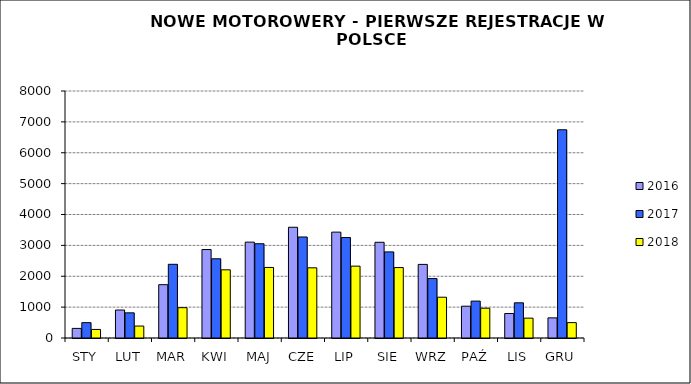
| Category | 2016 | 2017 | 2018 |
|---|---|---|---|
|  STY  | 311 | 497 | 277 |
|  LUT  | 906 | 815 | 387 |
| MAR | 1727 | 2387 | 982 |
| KWI | 2865 | 2566 | 2208 |
| MAJ | 3105 | 3053 | 2285 |
| CZE | 3587 | 3272 | 2273 |
| LIP | 3429 | 3254 | 2327 |
| SIE | 3100 | 2789 | 2281 |
| WRZ | 2384 | 1925 | 1321 |
| PAŹ | 1030 | 1195 | 965 |
| LIS | 794 | 1140 | 643 |
| GRU | 652 | 6744 | 498 |